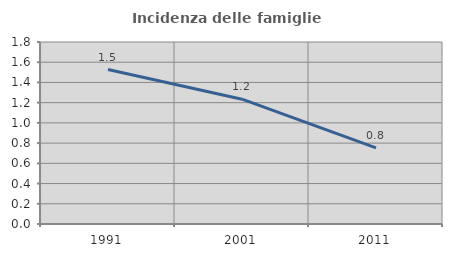
| Category | Incidenza delle famiglie numerose |
|---|---|
| 1991.0 | 1.527 |
| 2001.0 | 1.235 |
| 2011.0 | 0.753 |